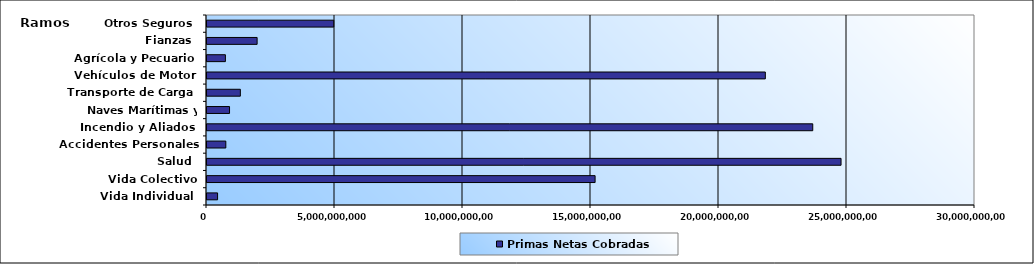
| Category | Primas Netas Cobradas |
|---|---|
| Vida Individual  | 413396033.93 |
| Vida Colectivo | 15160046848.43 |
| Salud  | 24767640027.16 |
| Accidentes Personales | 735373955.97 |
| Incendio y Aliados  | 23662326597.68 |
| Naves Marítimas y Aéreas  | 880670626.92 |
| Transporte de Carga  | 1302567955.25 |
| Vehículos de Motor  | 21809740927.31 |
| Agrícola y Pecuario  | 718642080.44 |
| Fianzas  | 1957987667.23 |
| Otros Seguros  | 4951444258.34 |